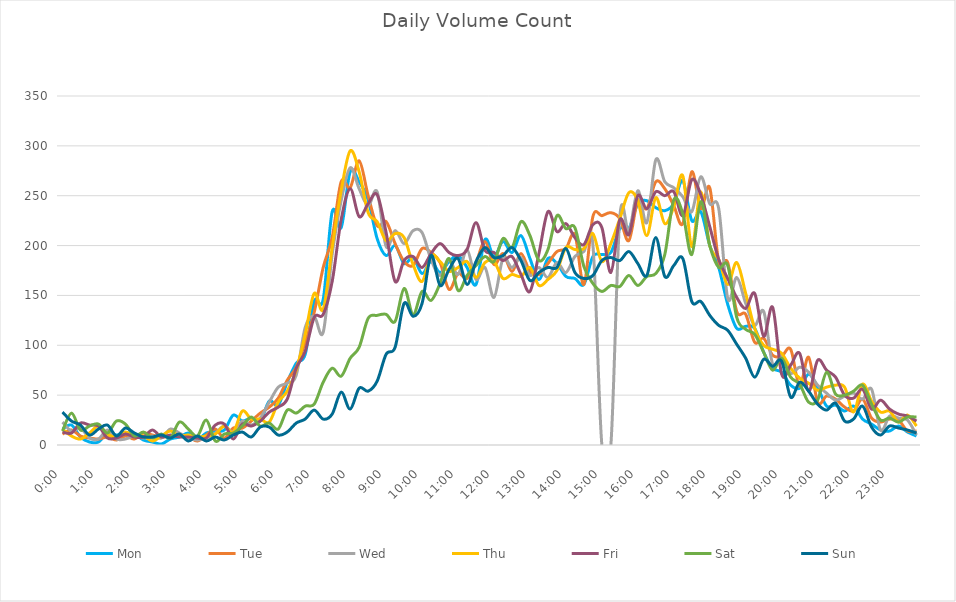
| Category | Mon | Tue | Wed | Thu | Fri | Sat | Sun |
|---|---|---|---|---|---|---|---|
| 0.0 | 16 | 11 | 23 | 16 | 13 | 14 | 33 |
| 0.010416666666666666 | 20 | 15 | 14 | 9 | 12 | 32 | 24 |
| 0.020833333333333332 | 8 | 9 | 17 | 6 | 22 | 15 | 20 |
| 0.03125 | 3 | 7 | 7 | 12 | 20 | 19 | 10 |
| 0.041666666666666664 | 3 | 6 | 6 | 19 | 19 | 21 | 16 |
| 0.05208333333333333 | 12 | 8 | 15 | 11 | 7 | 12 | 20 |
| 0.06249999999999999 | 10 | 5 | 6 | 8 | 7 | 24 | 9 |
| 0.07291666666666666 | 12 | 9 | 6 | 13 | 11 | 21 | 17 |
| 0.08333333333333333 | 11 | 6 | 9 | 9 | 8 | 9 | 12 |
| 0.09375 | 5 | 12 | 7 | 9 | 8 | 13 | 8 |
| 0.10416666666666667 | 3 | 10 | 9 | 4 | 15 | 7 | 8 |
| 0.11458333333333334 | 1 | 8 | 7 | 9 | 8 | 11 | 10 |
| 0.125 | 6 | 9 | 16 | 14 | 10 | 7 | 7 |
| 0.13541666666666666 | 8 | 9 | 12 | 9 | 8 | 23 | 11 |
| 0.14583333333333331 | 12 | 8 | 7 | 10 | 8 | 16 | 4 |
| 0.15624999999999997 | 6 | 4 | 5 | 8 | 7 | 9 | 9 |
| 0.16666666666666663 | 12 | 10 | 7 | 9 | 7 | 25 | 4 |
| 0.1770833333333333 | 14 | 16 | 12 | 11 | 20 | 4 | 8 |
| 0.18749999999999994 | 15 | 7 | 19 | 19 | 21 | 11 | 5 |
| 0.1979166666666666 | 30 | 17 | 13 | 13 | 6 | 12 | 10 |
| 0.20833333333333326 | 24 | 17 | 24 | 34 | 21 | 19 | 13 |
| 0.21874999999999992 | 27 | 24 | 20 | 26 | 19 | 28 | 8 |
| 0.22916666666666657 | 24 | 32 | 27 | 26 | 24 | 19 | 18 |
| 0.23958333333333323 | 44 | 38 | 43 | 23 | 33 | 22 | 18 |
| 0.2499999999999999 | 40 | 47 | 58 | 43 | 38 | 16 | 10 |
| 0.2604166666666666 | 63 | 65 | 62 | 54 | 46 | 35 | 13 |
| 0.27083333333333326 | 82 | 78 | 70 | 75 | 77 | 32 | 22 |
| 0.28124999999999994 | 91 | 103 | 118 | 111 | 94 | 39 | 26 |
| 0.29166666666666663 | 144 | 133 | 129 | 152 | 128 | 41 | 35 |
| 0.3020833333333333 | 146 | 178 | 113 | 136 | 131 | 63 | 26 |
| 0.3125 | 234 | 208 | 191 | 198 | 164 | 77 | 31 |
| 0.3229166666666667 | 218 | 264 | 245 | 255 | 226 | 69 | 53 |
| 0.33333333333333337 | 274 | 258 | 278 | 295 | 257 | 87 | 36 |
| 0.34375000000000006 | 264 | 285 | 257 | 274 | 229 | 98 | 57 |
| 0.35416666666666674 | 246 | 250 | 240 | 233 | 242 | 127 | 54 |
| 0.3645833333333334 | 207 | 220 | 254 | 224 | 251 | 130 | 64 |
| 0.3750000000000001 | 190 | 224 | 199 | 205 | 213 | 131 | 91 |
| 0.3854166666666668 | 200 | 202 | 215 | 212 | 164 | 124 | 98 |
| 0.3958333333333335 | 182 | 184 | 202 | 208 | 185 | 157 | 142 |
| 0.40625000000000017 | 188 | 180 | 215 | 181 | 189 | 131 | 129 |
| 0.41666666666666685 | 172 | 197 | 213 | 164 | 178 | 154 | 142 |
| 0.4270833333333333 | 184 | 193 | 186 | 190 | 192 | 145 | 190 |
| 0.4375000000000002 | 173 | 183 | 170 | 184 | 202 | 162 | 160 |
| 0.4479166666666669 | 184 | 156 | 186 | 174 | 193 | 187 | 176 |
| 0.4583333333333333 | 190 | 172 | 171 | 178 | 190 | 155 | 187 |
| 0.4687500000000003 | 178 | 167 | 196 | 184 | 196 | 170 | 161 |
| 0.47916666666666696 | 161 | 183 | 166 | 168 | 223 | 180 | 184 |
| 0.4895833333333333 | 206 | 204 | 178 | 183 | 195 | 189 | 198 |
| 0.5000000000000003 | 189 | 181 | 148 | 184 | 193 | 184 | 188 |
| 0.510416666666667 | 204 | 192 | 187 | 167 | 185 | 207 | 190 |
| 0.5208333333333334 | 193 | 174 | 178 | 171 | 189 | 198 | 198 |
| 0.5312500000000002 | 210 | 192 | 188 | 169 | 171 | 224 | 185 |
| 0.5416666666666669 | 187 | 174 | 170 | 178 | 154 | 210 | 165 |
| 0.5520833333333335 | 166 | 171 | 178 | 160 | 192 | 185 | 173 |
| 0.5625000000000001 | 187 | 182 | 168 | 166 | 234 | 196 | 178 |
| 0.5729166666666667 | 182 | 194 | 183 | 175 | 214 | 230 | 178 |
| 0.5833333333333334 | 169 | 197 | 173 | 198 | 222 | 217 | 197 |
| 0.59375 | 167 | 211 | 189 | 196 | 208 | 218 | 173 |
| 0.6041666666666666 | 161 | 161 | 194 | 197 | 201 | 179 | 167 |
| 0.6145833333333333 | 189 | 229 | 201 | 212 | 221 | 162 | 170 |
| 0.6249999999999999 | 191 | 230 | 0 | 184 | 218 | 154 | 185 |
| 0.6354166666666665 | 193 | 233 | 0 | 202 | 173 | 160 | 188 |
| 0.6458333333333331 | 217 | 227 | 229 | 227 | 226 | 159 | 185 |
| 0.6562499999999998 | 217 | 205 | 214 | 253 | 211 | 170 | 194 |
| 0.6666666666666666 | 242 | 245 | 255 | 245 | 250 | 160 | 182 |
| 0.677083333333333 | 245 | 237 | 223 | 210 | 237 | 169 | 170 |
| 0.6874999999999997 | 238 | 264 | 286 | 248 | 254 | 172 | 208 |
| 0.6979166666666666 | 235 | 257 | 264 | 222 | 250 | 191 | 169 |
| 0.7083333333333329 | 242 | 240 | 258 | 239 | 254 | 246 | 180 |
| 0.7187499999999996 | 265 | 222 | 249 | 270 | 230 | 232 | 187 |
| 0.7291666666666666 | 225 | 274 | 234 | 199 | 266 | 191 | 144 |
| 0.7395833333333328 | 234 | 237 | 269 | 254 | 251 | 244 | 144 |
| 0.75 | 200 | 258 | 242 | 200 | 219 | 200 | 130 |
| 0.7604166666666666 | 178 | 184 | 237 | 186 | 186 | 178 | 120 |
| 0.7708333333333327 | 141 | 183 | 147 | 161 | 167 | 180 | 115 |
| 0.78125 | 117 | 134 | 168 | 183 | 148 | 128 | 101 |
| 0.7916666666666666 | 119 | 131 | 142 | 152 | 137 | 116 | 87 |
| 0.8020833333333326 | 117 | 103 | 120 | 117 | 152 | 111 | 68 |
| 0.8125 | 93 | 107 | 134 | 100 | 109 | 93 | 86 |
| 0.8229166666666666 | 77 | 90 | 81 | 96 | 138 | 75 | 79 |
| 0.8333333333333334 | 73 | 89 | 90 | 92 | 71 | 87 | 84 |
| 0.84375 | 60 | 96 | 72 | 77 | 80 | 68 | 48 |
| 0.8541666666666666 | 57 | 59 | 78 | 67 | 92 | 61 | 63 |
| 0.8645833333333334 | 71 | 88 | 73 | 62 | 54 | 43 | 54 |
| 0.875 | 58 | 43 | 60 | 55 | 85 | 45 | 41 |
| 0.8854166666666666 | 39 | 49 | 52 | 58 | 75 | 73 | 35 |
| 0.8958333333333334 | 40 | 46 | 45 | 60 | 68 | 51 | 42 |
| 0.90625 | 34 | 38 | 49 | 58 | 50 | 50 | 24 |
| 0.9166666666666666 | 39 | 34 | 52 | 33 | 47 | 54 | 26 |
| 0.9270833333333334 | 26 | 46 | 46 | 61 | 56 | 60 | 39 |
| 0.9375 | 21 | 27 | 56 | 44 | 36 | 41 | 18 |
| 0.9479166666666666 | 15 | 23 | 15 | 33 | 45 | 25 | 10 |
| 0.9583333333333334 | 14 | 26 | 29 | 34 | 36 | 27 | 19 |
| 0.96875 | 19 | 25 | 27 | 23 | 31 | 23 | 17 |
| 0.9791666666666666 | 13 | 14 | 25 | 30 | 29 | 28 | 15 |
| 0.9895833333333334 | 9 | 14 | 10 | 19 | 24 | 28 | 12 |